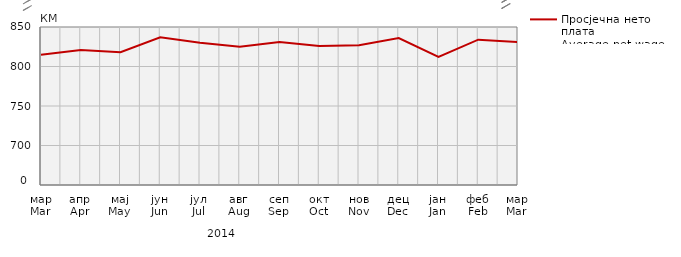
| Category | Просјечна нето плата
Average net wage |
|---|---|
| мар
Mar | 815 |
| апр
Apr | 821 |
| мај
May | 818 |
| јун
Jun | 837 |
| јул
Jul | 830 |
| авг
Aug | 825 |
| сеп
Sep | 831 |
| окт
Oct | 826 |
| нов
Nov | 827 |
| дец
Dec | 836 |
| јан
Jan | 812 |
| феб
Feb | 834 |
| мар
Mar | 831 |